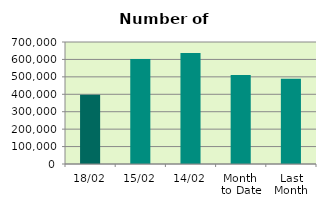
| Category | Series 0 |
|---|---|
| 18/02 | 397294 |
| 15/02 | 602150 |
| 14/02 | 636436 |
| Month 
to Date | 511123.833 |
| Last
Month | 488780.727 |